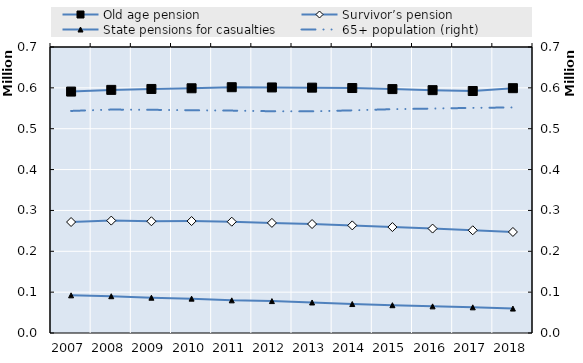
| Category | Old age pension | Survivor’s pension  |
|---|---|---|
| 2007.0 | 590915 | 271662 |
| 2008.0 | 595039 | 275091 |
| 2009.0 | 597300 | 273500 |
| 2010.0 | 599000 | 274000 |
| 2011.0 | 601600 | 272423 |
| 2012.0 | 601000 | 269484 |
| 2013.0 | 600500 | 266700 |
| 2014.0 | 599600 | 263400 |
| 2015.0 | 597000 | 259300 |
| 2016.0 | 594400 | 255600 |
| 2017.0 | 592300 | 251440 |
| 2018.0 | 599200 | 247300 |